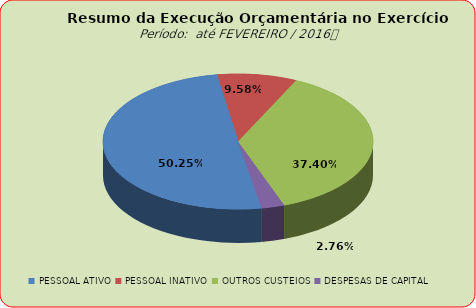
| Category | Series 0 |
|---|---|
| PESSOAL ATIVO | 24372003.32 |
| PESSOAL INATIVO | 4646051.55 |
| OUTROS CUSTEIOS | 18138195.52 |
| DESPESAS DE CAPITAL | 1340660.35 |